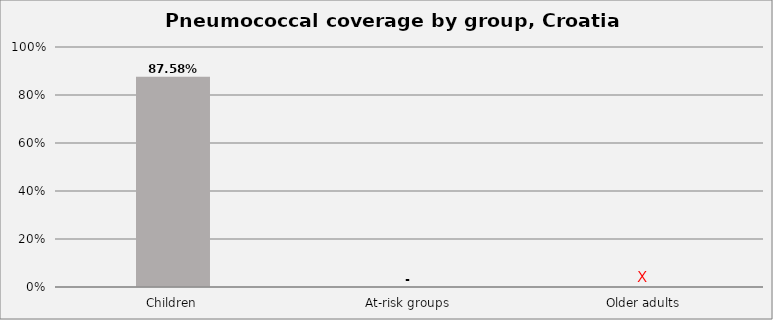
| Category | Series 0 |
|---|---|
| Children | 0.876 |
| At-risk groups | 0 |
| Older adults | 0 |